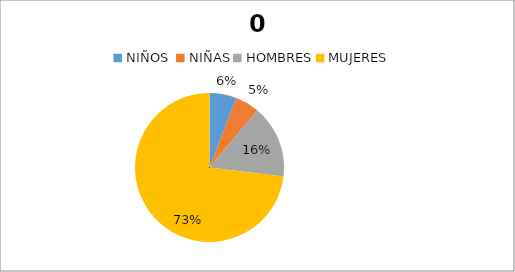
| Category | 0 PORCENTAJE | 0 CANTIDAD |
|---|---|---|
| NIÑOS  | 5.848 | 10 |
| NIÑAS | 5.263 | 9 |
| HOMBRES | 15.789 | 27 |
| MUJERES | 73.099 | 125 |